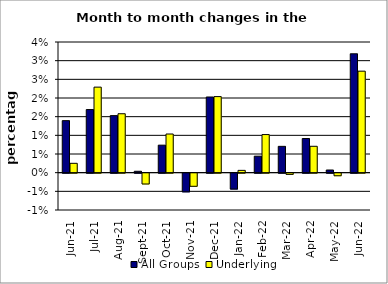
| Category | All Groups | Underlying |
|---|---|---|
| 2021-06-01 | 0.014 | 0.003 |
| 2021-07-01 | 0.017 | 0.023 |
| 2021-08-01 | 0.015 | 0.016 |
| 2021-09-01 | 0 | -0.003 |
| 2021-10-01 | 0.007 | 0.01 |
| 2021-11-01 | -0.005 | -0.004 |
| 2021-12-01 | 0.02 | 0.02 |
| 2022-01-01 | -0.004 | 0.001 |
| 2022-02-01 | 0.004 | 0.01 |
| 2022-03-01 | 0.007 | 0 |
| 2022-04-01 | 0.009 | 0.007 |
| 2022-05-01 | 0.001 | -0.001 |
| 2022-06-01 | 0.032 | 0.027 |